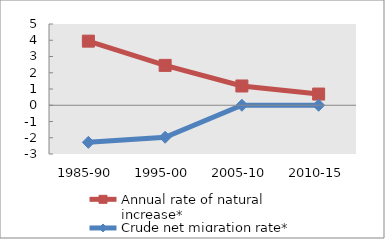
| Category | Annual rate of natural increase* | Crude net migration rate* |
|---|---|---|
| 1985-90 | 3.945 | -2.283 |
| 1995-00 | 2.453 | -1.969 |
| 2005-10 | 1.186 | 0 |
| 2010-15 | 0.689 | 0 |